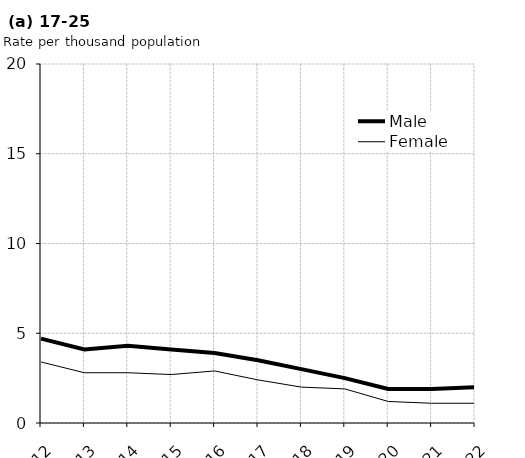
| Category | Male | Female |
|---|---|---|
| 2012.0 | 4.7 | 3.4 |
| 2013.0 | 4.1 | 2.8 |
| 2014.0 | 4.3 | 2.8 |
| 2015.0 | 4.1 | 2.7 |
| 2016.0 | 3.9 | 2.9 |
| 2017.0 | 3.5 | 2.4 |
| 2018.0 | 3 | 2 |
| 2019.0 | 2.5 | 1.9 |
| 2020.0 | 1.9 | 1.2 |
| 2021.0 | 1.9 | 1.1 |
| 2022.0 | 2 | 1.1 |